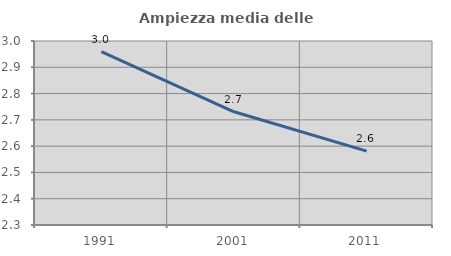
| Category | Ampiezza media delle famiglie |
|---|---|
| 1991.0 | 2.96 |
| 2001.0 | 2.731 |
| 2011.0 | 2.581 |